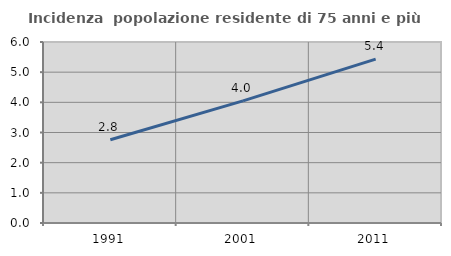
| Category | Incidenza  popolazione residente di 75 anni e più |
|---|---|
| 1991.0 | 2.759 |
| 2001.0 | 4.049 |
| 2011.0 | 5.431 |